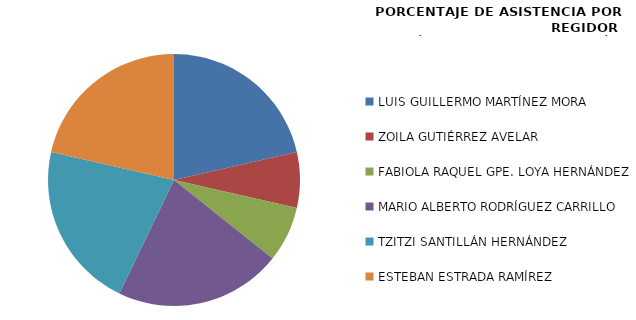
| Category | Series 0 |
|---|---|
| LUIS GUILLERMO MARTÍNEZ MORA | 100 |
| ZOILA GUTIÉRREZ AVELAR | 33.333 |
| FABIOLA RAQUEL GPE. LOYA HERNÁNDEZ | 33.333 |
| MARIO ALBERTO RODRÍGUEZ CARRILLO | 100 |
| TZITZI SANTILLÁN HERNÁNDEZ | 100 |
| ESTEBAN ESTRADA RAMÍREZ | 100 |